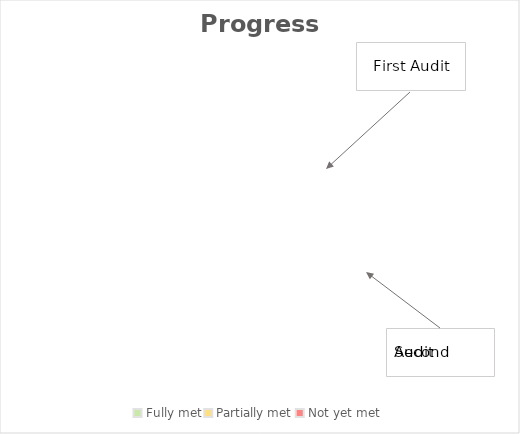
| Category | Term 1 | Term 2 | Term 3 |
|---|---|---|---|
| Fully met | 0 | 0 | 0 |
| Partially met | 0 | 0 | 0 |
| Not yet met | 0 | 0 | 0 |